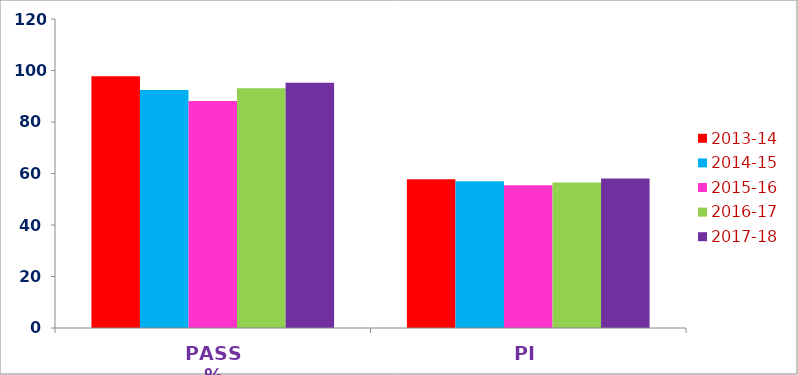
| Category | 2013-14 | 2014-15 | 2015-16 | 2016-17 | 2017-18 |
|---|---|---|---|---|---|
| PASS % | 97.75 | 92.47 | 88.16 | 93.06 | 95.26 |
| PI | 57.8 | 57 | 55.47 | 56.49 | 58.02 |